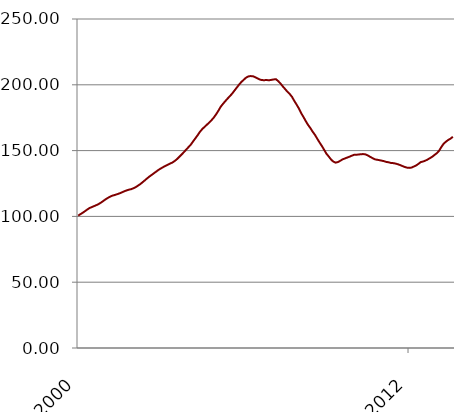
| Category | Series 0 |
|---|---|
| 2000-01-01 | 100.59 |
| 2000-02-01 | 101.69 |
| 2000-03-01 | 102.78 |
| 2000-04-01 | 104 |
| 2000-05-01 | 105.25 |
| 2000-06-01 | 106.4 |
| 2000-07-01 | 107.13 |
| 2000-08-01 | 107.86 |
| 2000-09-01 | 108.61 |
| 2000-10-01 | 109.49 |
| 2000-11-01 | 110.57 |
| 2000-12-01 | 111.8 |
| 2001-01-01 | 113.05 |
| 2001-02-01 | 114.13 |
| 2001-03-01 | 115.09 |
| 2001-04-01 | 115.84 |
| 2001-05-01 | 116.3 |
| 2001-06-01 | 116.9 |
| 2001-07-01 | 117.5 |
| 2001-08-01 | 118.24 |
| 2001-09-01 | 119.03 |
| 2001-10-01 | 119.69 |
| 2001-11-01 | 120.27 |
| 2001-12-01 | 120.67 |
| 2002-01-01 | 121.36 |
| 2002-02-01 | 122.19 |
| 2002-03-01 | 123.33 |
| 2002-04-01 | 124.5 |
| 2002-05-01 | 125.93 |
| 2002-06-01 | 127.39 |
| 2002-07-01 | 128.88 |
| 2002-08-01 | 130.3 |
| 2002-09-01 | 131.53 |
| 2002-10-01 | 132.85 |
| 2002-11-01 | 134.1 |
| 2002-12-01 | 135.4 |
| 2003-01-01 | 136.47 |
| 2003-02-01 | 137.46 |
| 2003-03-01 | 138.39 |
| 2003-04-01 | 139.24 |
| 2003-05-01 | 140.15 |
| 2003-06-01 | 140.92 |
| 2003-07-01 | 142.12 |
| 2003-08-01 | 143.53 |
| 2003-09-01 | 145.26 |
| 2003-10-01 | 146.99 |
| 2003-11-01 | 148.82 |
| 2003-12-01 | 150.76 |
| 2004-01-01 | 152.63 |
| 2004-02-01 | 154.54 |
| 2004-03-01 | 156.96 |
| 2004-04-01 | 159.34 |
| 2004-05-01 | 161.75 |
| 2004-06-01 | 164.31 |
| 2004-07-01 | 166.39 |
| 2004-08-01 | 168.03 |
| 2004-09-01 | 169.65 |
| 2004-10-01 | 171.29 |
| 2004-11-01 | 173.08 |
| 2004-12-01 | 175.08 |
| 2005-01-01 | 177.55 |
| 2005-02-01 | 180.26 |
| 2005-03-01 | 183.29 |
| 2005-04-01 | 185.5 |
| 2005-05-01 | 187.55 |
| 2005-06-01 | 189.53 |
| 2005-07-01 | 191.38 |
| 2005-08-01 | 193.31 |
| 2005-09-01 | 195.61 |
| 2005-10-01 | 197.87 |
| 2005-11-01 | 200.13 |
| 2005-12-01 | 202.16 |
| 2006-01-01 | 203.76 |
| 2006-02-01 | 205.37 |
| 2006-03-01 | 206.35 |
| 2006-04-01 | 206.63 |
| 2006-05-01 | 206.5 |
| 2006-06-01 | 205.81 |
| 2006-07-01 | 204.93 |
| 2006-08-01 | 204.02 |
| 2006-09-01 | 203.57 |
| 2006-10-01 | 203.52 |
| 2006-11-01 | 203.62 |
| 2006-12-01 | 203.44 |
| 2007-01-01 | 203.72 |
| 2007-02-01 | 204.06 |
| 2007-03-01 | 204.28 |
| 2007-04-01 | 202.87 |
| 2007-05-01 | 201.01 |
| 2007-06-01 | 198.84 |
| 2007-07-01 | 196.84 |
| 2007-08-01 | 194.79 |
| 2007-09-01 | 193.1 |
| 2007-10-01 | 190.93 |
| 2007-11-01 | 187.85 |
| 2007-12-01 | 185.04 |
| 2008-01-01 | 182.08 |
| 2008-02-01 | 178.51 |
| 2008-03-01 | 175.59 |
| 2008-04-01 | 172.45 |
| 2008-05-01 | 169.54 |
| 2008-06-01 | 167.18 |
| 2008-07-01 | 164.39 |
| 2008-08-01 | 162 |
| 2008-09-01 | 159.07 |
| 2008-10-01 | 156.23 |
| 2008-11-01 | 153.58 |
| 2008-12-01 | 150.64 |
| 2009-01-01 | 147.63 |
| 2009-02-01 | 145.56 |
| 2009-03-01 | 143.27 |
| 2009-04-01 | 141.63 |
| 2009-05-01 | 140.85 |
| 2009-06-01 | 141.32 |
| 2009-07-01 | 142.22 |
| 2009-08-01 | 143.33 |
| 2009-09-01 | 143.98 |
| 2009-10-01 | 144.68 |
| 2009-11-01 | 145.34 |
| 2009-12-01 | 146.11 |
| 2010-01-01 | 146.78 |
| 2010-02-01 | 146.85 |
| 2010-03-01 | 147.02 |
| 2010-04-01 | 147.27 |
| 2010-05-01 | 147.35 |
| 2010-06-01 | 147.12 |
| 2010-07-01 | 146.33 |
| 2010-08-01 | 145.3 |
| 2010-09-01 | 144.36 |
| 2010-10-01 | 143.42 |
| 2010-11-01 | 143.06 |
| 2010-12-01 | 142.75 |
| 2011-01-01 | 142.37 |
| 2011-02-01 | 142.01 |
| 2011-03-01 | 141.42 |
| 2011-04-01 | 141.15 |
| 2011-05-01 | 140.65 |
| 2011-06-01 | 140.5 |
| 2011-07-01 | 140.17 |
| 2011-08-01 | 139.67 |
| 2011-09-01 | 139.07 |
| 2011-10-01 | 138.32 |
| 2011-11-01 | 137.6 |
| 2011-12-01 | 137.07 |
| 2012-01-01 | 136.87 |
| 2012-02-01 | 137.08 |
| 2012-03-01 | 137.88 |
| 2012-04-01 | 138.67 |
| 2012-05-01 | 139.88 |
| 2012-06-01 | 141.23 |
| 2012-07-01 | 141.69 |
| 2012-08-01 | 142.34 |
| 2012-09-01 | 143.2 |
| 2012-10-01 | 144.25 |
| 2012-11-01 | 145.27 |
| 2012-12-01 | 146.67 |
| 2013-01-01 | 148 |
| 2013-02-01 | 149.86 |
| 2013-03-01 | 152.71 |
| 2013-04-01 | 155.25 |
| 2013-05-01 | 156.77 |
| 2013-06-01 | 158.12 |
| 2013-07-01 | 159.07 |
| 2013-08-01 | 160.55 |